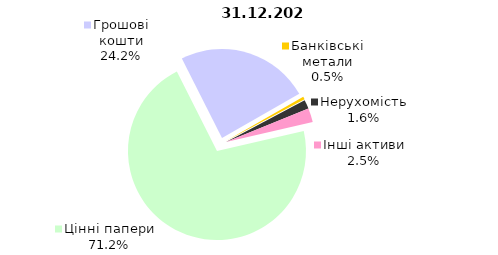
| Category | Всього |
|---|---|
| Цінні папери | 1561.157 |
| Грошові кошти | 530.417 |
| Банківські метали | 10.949 |
| Нерухомість | 35.543 |
| Інші активи | 55.768 |